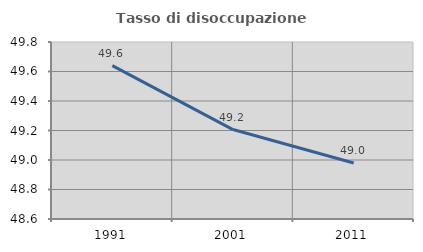
| Category | Tasso di disoccupazione giovanile  |
|---|---|
| 1991.0 | 49.64 |
| 2001.0 | 49.206 |
| 2011.0 | 48.98 |